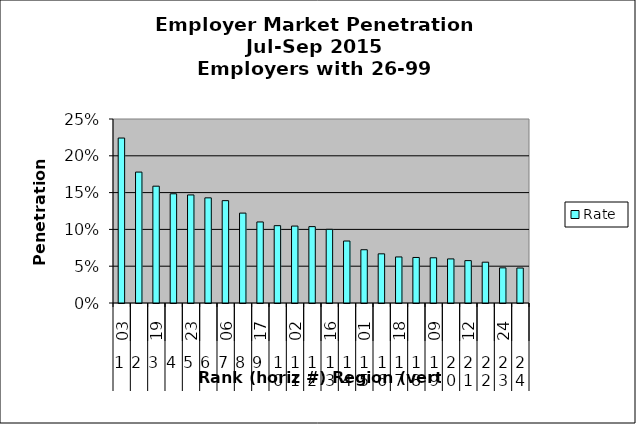
| Category | Rate |
|---|---|
| 0 | 0.224 |
| 1 | 0.178 |
| 2 | 0.159 |
| 3 | 0.148 |
| 4 | 0.147 |
| 5 | 0.143 |
| 6 | 0.139 |
| 7 | 0.122 |
| 8 | 0.11 |
| 9 | 0.105 |
| 10 | 0.105 |
| 11 | 0.104 |
| 12 | 0.1 |
| 13 | 0.084 |
| 14 | 0.072 |
| 15 | 0.067 |
| 16 | 0.063 |
| 17 | 0.062 |
| 18 | 0.061 |
| 19 | 0.06 |
| 20 | 0.058 |
| 21 | 0.055 |
| 22 | 0.048 |
| 23 | 0.048 |